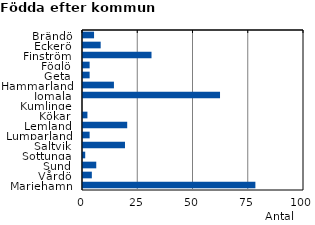
| Category | Series 0 |
|---|---|
| Brändö | 5 |
| Eckerö | 8 |
| Finström | 31 |
| Föglö | 3 |
| Geta | 3 |
| Hammarland | 14 |
| Jomala | 62 |
| Kumlinge | 0 |
| Kökar | 2 |
| Lemland | 20 |
| Lumparland | 3 |
| Saltvik | 19 |
| Sottunga | 1 |
| Sund | 6 |
| Vårdö | 4 |
| Mariehamn | 78 |